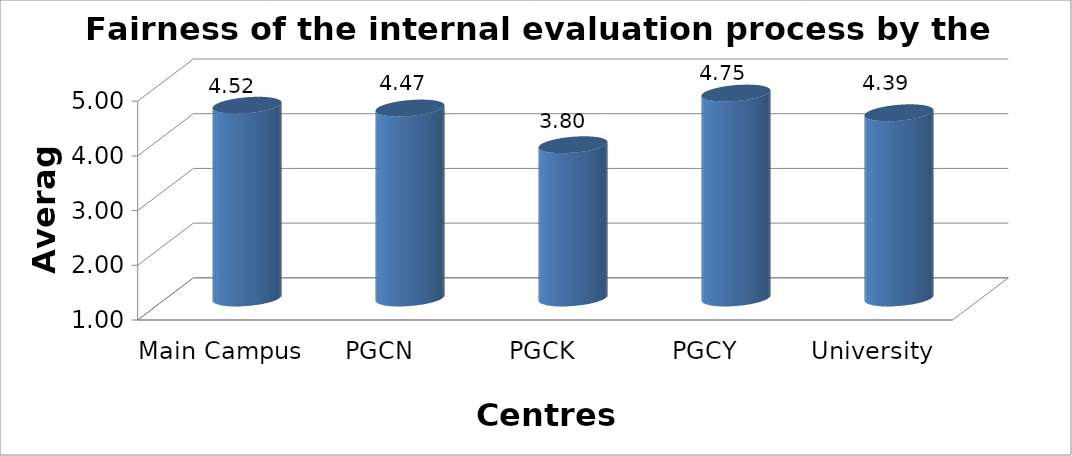
| Category | Fairness of the internal evaluation process by the teachers |
|---|---|
| Main Campus | 4.524 |
| PGCN | 4.473 |
| PGCK | 3.802 |
| PGCY | 4.747 |
| University Avg | 4.386 |